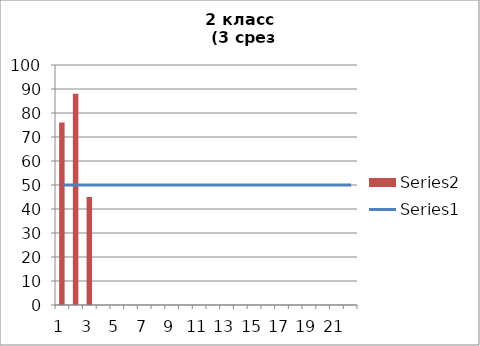
| Category | Series 1 |
|---|---|
| 0 | 76 |
| 1 | 88 |
| 2 | 45 |
| 3 | 0 |
| 4 | 0 |
| 5 | 0 |
| 6 | 0 |
| 7 | 0 |
| 8 | 0 |
| 9 | 0 |
| 10 | 0 |
| 11 | 0 |
| 12 | 0 |
| 13 | 0 |
| 14 | 0 |
| 15 | 0 |
| 16 | 0 |
| 17 | 0 |
| 18 | 0 |
| 19 | 0 |
| 20 | 0 |
| 21 | 0 |